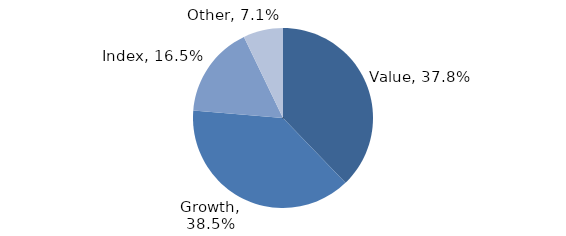
| Category | Investment Style |
|---|---|
| Value | 0.378 |
| Growth | 0.385 |
| Index | 0.165 |
| Other | 0.071 |